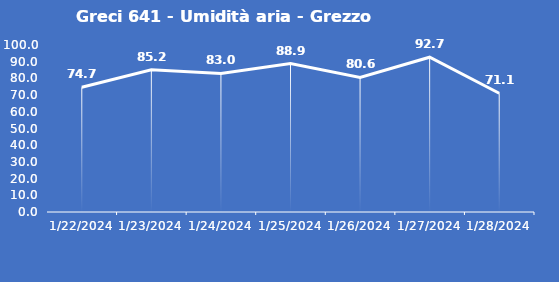
| Category | Greci 641 - Umidità aria - Grezzo (%) |
|---|---|
| 1/22/24 | 74.7 |
| 1/23/24 | 85.2 |
| 1/24/24 | 83 |
| 1/25/24 | 88.9 |
| 1/26/24 | 80.6 |
| 1/27/24 | 92.7 |
| 1/28/24 | 71.1 |